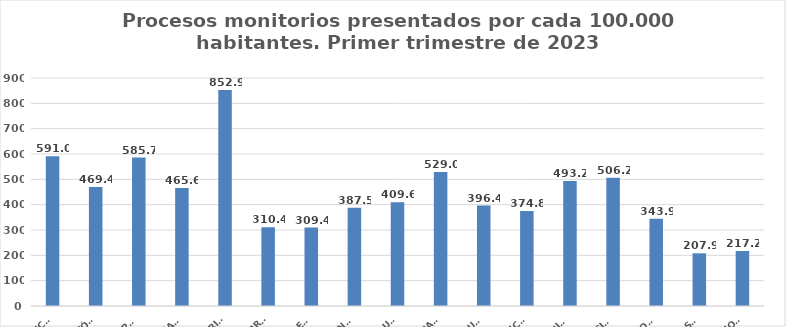
| Category | Series 0 |
|---|---|
| ANDALUCÍA | 591.014 |
| ARAGÓN | 469.419 |
| ASTURIAS, PRINCIPADO | 585.731 |
| ILLES BALEARS | 465.557 |
| CANARIAS | 852.861 |
| CANTABRIA | 310.435 |
| CASTILLA - LEÓN | 309.415 |
| CASTILLA - LA MANCHA | 387.48 |
| CATALUÑA | 409.593 |
| C. VALENCIANA | 529.026 |
| EXTREMADURA | 396.375 |
| GALICIA | 374.817 |
| MADRID, COMUNIDAD | 493.185 |
| MURCIA, REGIÓN | 506.155 |
| NAVARRA, COM. FORAL | 343.945 |
| PAÍS VASCO | 207.936 |
| LA RIOJA | 217.214 |